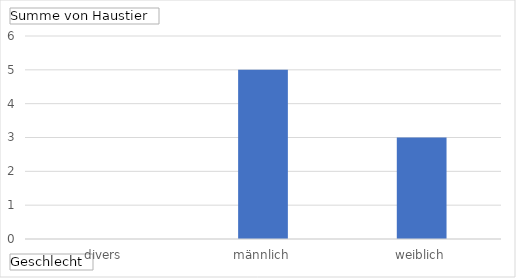
| Category | Ergebnis |
|---|---|
| divers | 0 |
| männlich | 5 |
| weiblich | 3 |